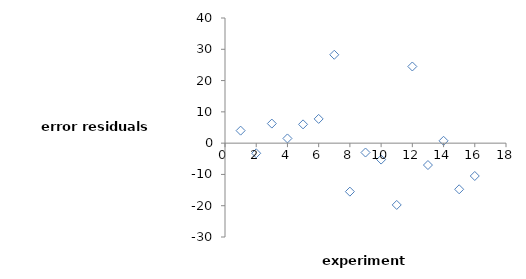
| Category | e |
|---|---|
| 1.0 | 4 |
| 2.0 | -3.25 |
| 3.0 | 6.25 |
| 4.0 | 1.5 |
| 5.0 | 6 |
| 6.0 | 7.75 |
| 7.0 | 28.25 |
| 8.0 | -15.5 |
| 9.0 | -3 |
| 10.0 | -5.25 |
| 11.0 | -19.75 |
| 12.0 | 24.5 |
| 13.0 | -7 |
| 14.0 | 0.75 |
| 15.0 | -14.75 |
| 16.0 | -10.5 |